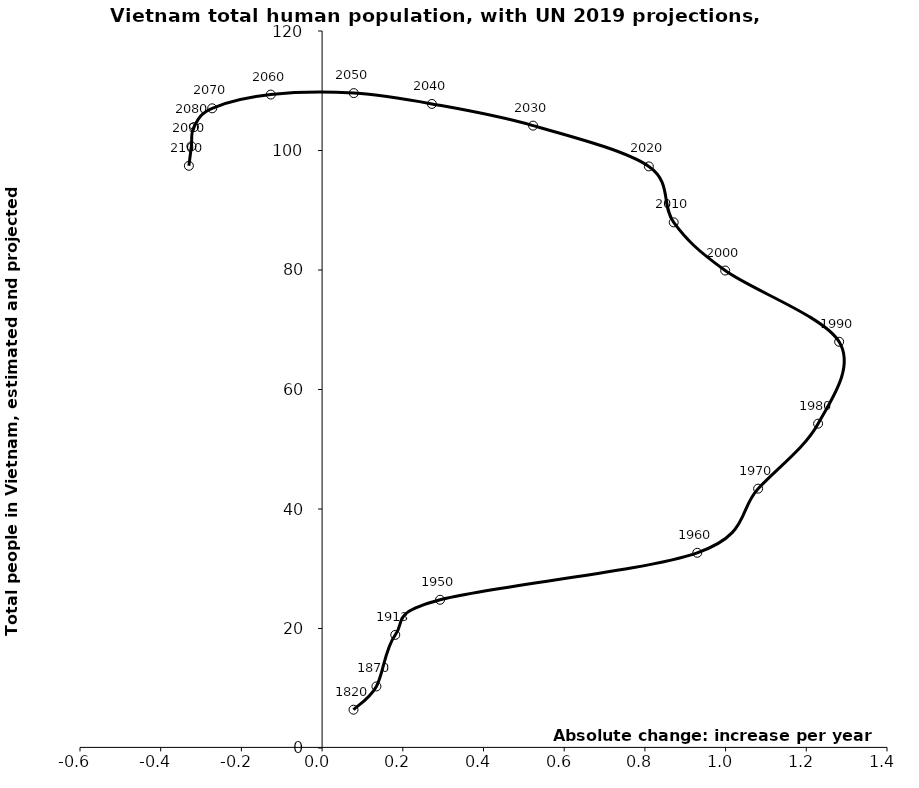
| Category | Series 0 |
|---|---|
| 0.07785149144232291 | 6.412 |
| 0.13458635440941671 | 10.305 |
| 0.1813174351230868 | 18.928 |
| 0.2923739451465383 | 24.81 |
| 0.92974455 | 32.67 |
| 1.08059035 | 43.405 |
| 1.2292034499999989 | 54.282 |
| 1.2814283000000004 | 67.989 |
| 0.9989394499999988 | 79.91 |
| 0.8714083500000008 | 87.968 |
| 0.8097934000000017 | 97.339 |
| 0.5228225999999999 | 104.164 |
| 0.27207459999999983 | 107.795 |
| 0.07841530000000034 | 109.605 |
| -0.1271379999999965 | 109.363 |
| -0.2723888499999987 | 107.062 |
| -0.3176581999999996 | 103.916 |
| -0.3239141000000011 | 100.709 |
| -0.3301700000000026 | 97.437 |